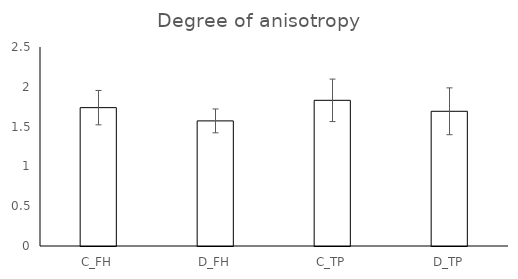
| Category | Series 0 |
|---|---|
| C_FH | 1.738 |
| D_FH | 1.572 |
| C_TP | 1.83 |
| D_TP | 1.692 |